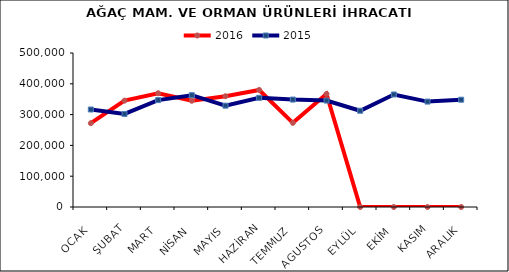
| Category | 2016 | 2015 |
|---|---|---|
| OCAK | 272172.425 | 316515.246 |
| ŞUBAT | 345298.778 | 302157.685 |
| MART | 369387.002 | 347074.115 |
| NİSAN | 344901.527 | 362996.076 |
| MAYIS | 359680.102 | 328956.031 |
| HAZİRAN | 380004.522 | 354469.402 |
| TEMMUZ | 273203.3 | 348784.415 |
| AGUSTOS | 367065.707 | 345592.842 |
| EYLÜL | 0 | 312462.864 |
| EKİM | 0 | 365310.717 |
| KASIM | 0 | 342247.544 |
| ARALIK | 0 | 348350.661 |